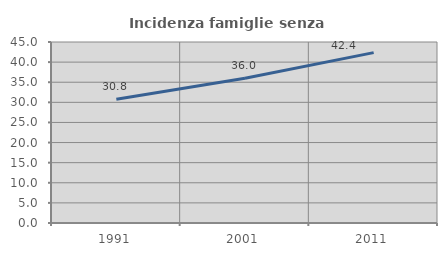
| Category | Incidenza famiglie senza nuclei |
|---|---|
| 1991.0 | 30.772 |
| 2001.0 | 35.971 |
| 2011.0 | 42.36 |